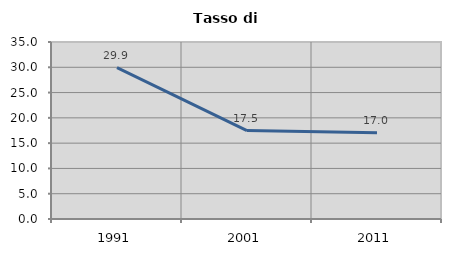
| Category | Tasso di disoccupazione   |
|---|---|
| 1991.0 | 29.945 |
| 2001.0 | 17.487 |
| 2011.0 | 17.047 |